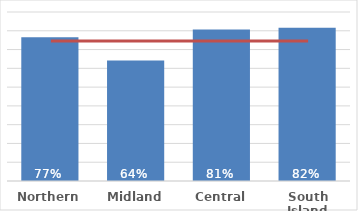
| Category | Dep 5 |
|---|---|
| Northern | 0.766 |
| Midland | 0.641 |
| Central | 0.807 |
| South Island | 0.816 |